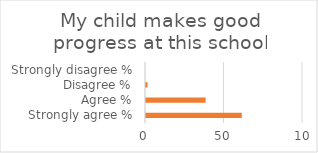
| Category | Series 1 |
|---|---|
| Strongly agree % | 61 |
| Agree % | 38 |
| Disagree % | 1 |
| Strongly disagree % | 0 |